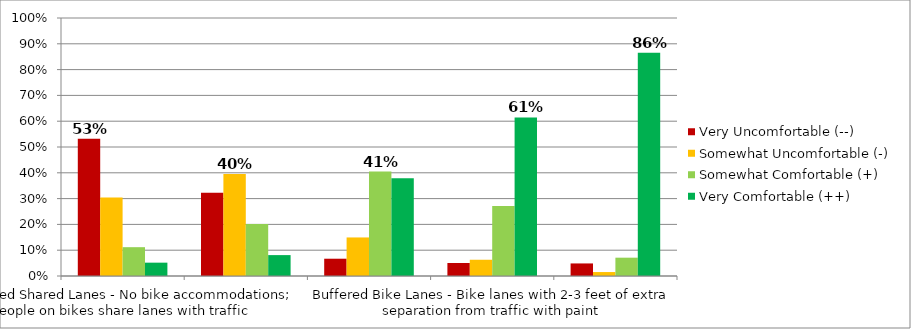
| Category | Very Uncomfortable (--) | Somewhat Uncomfortable (-) | Somewhat Comfortable (+) | Very Comfortable (++) |
|---|---|---|---|---|
| Unmarked Shared Lanes - No bike accommodations; people on bikes share lanes with traffic | 0.532 | 0.304 | 0.112 | 0.052 |
| Sharrows - Markings indicate where to ride, but no dedicated space for people on bikes | 0.323 | 0.395 | 0.201 | 0.081 |
| Bike Lanes - Standard 5-foot wide painted bike lanes for exclusive use by people on bikes | 0.067 | 0.149 | 0.405 | 0.378 |
| Buffered Bike Lanes - Bike lanes with 2-3 feet of extra separation from traffic with paint | 0.05 | 0.063 | 0.272 | 0.615 |
| Protected Bike Lanes - Bike lanes separated from traffic with posts, planter boxes, or curbs | 0.049 | 0.015 | 0.071 | 0.865 |